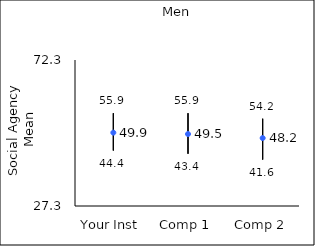
| Category | 25th percentile | 75th percentile | Mean |
|---|---|---|---|
| Your Inst | 44.4 | 55.9 | 49.91 |
| Comp 1 | 43.4 | 55.9 | 49.48 |
| Comp 2 | 41.6 | 54.2 | 48.24 |